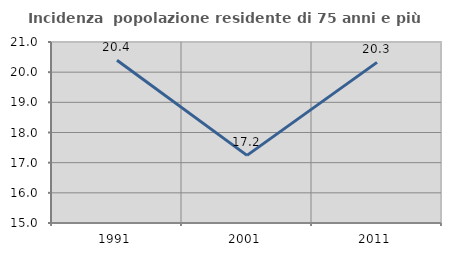
| Category | Incidenza  popolazione residente di 75 anni e più |
|---|---|
| 1991.0 | 20.395 |
| 2001.0 | 17.241 |
| 2011.0 | 20.325 |